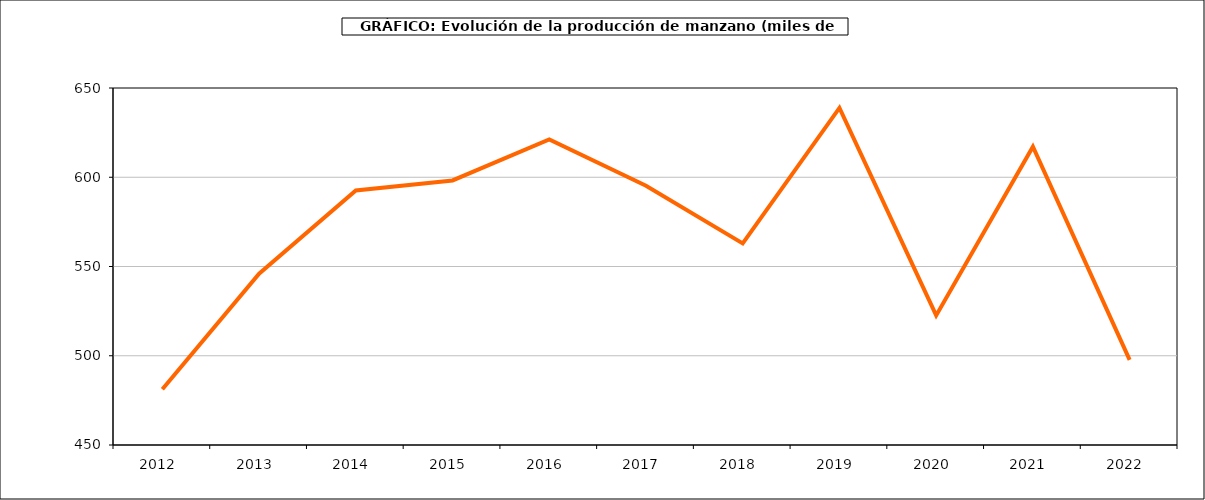
| Category | producción manzano |
|---|---|
| 2012.0 | 481.223 |
| 2013.0 | 545.992 |
| 2014.0 | 592.576 |
| 2015.0 | 598.207 |
| 2016.0 | 621.164 |
| 2017.0 | 595.202 |
| 2018.0 | 562.961 |
| 2019.0 | 638.839 |
| 2020.0 | 522.618 |
| 2021.0 | 617.095 |
| 2022.0 | 497.679 |